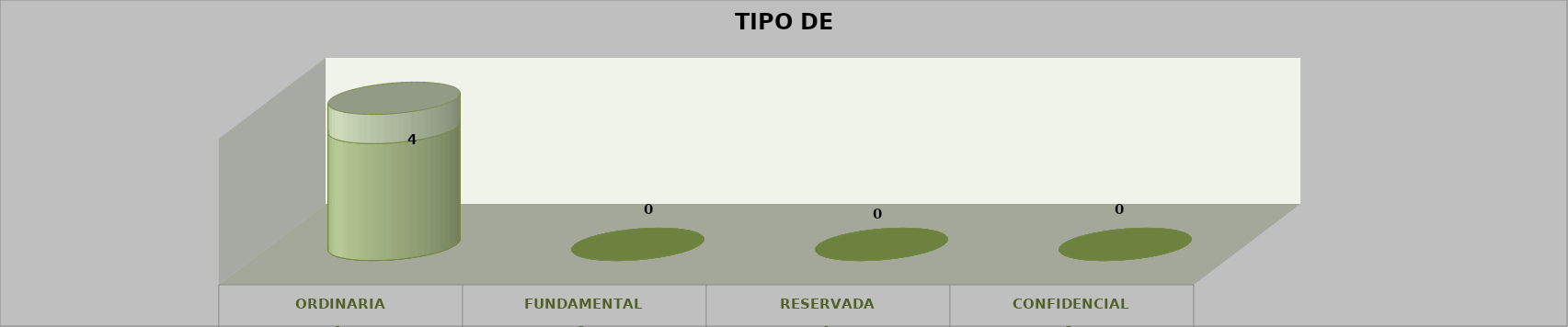
| Category | Series 0 | Series 2 | Series 1 | Series 3 | Series 4 |
|---|---|---|---|---|---|
| 0 |  |  |  | 4 | 1 |
| 1 |  |  |  | 0 | 0 |
| 2 |  |  |  | 0 | 0 |
| 3 |  |  |  | 0 | 0 |